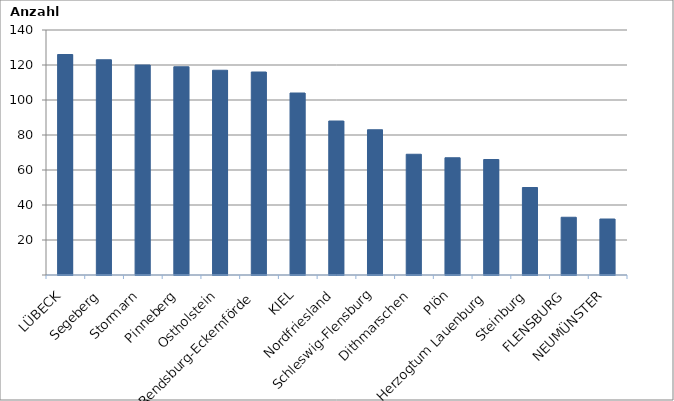
| Category | Series 0 |
|---|---|
| LÜBECK | 126 |
| Segeberg | 123 |
| Stormarn | 120 |
| Pinneberg | 119 |
| Ostholstein | 117 |
| Rendsburg-Eckernförde | 116 |
| KIEL | 104 |
| Nordfriesland | 88 |
| Schleswig-Flensburg | 83 |
| Dithmarschen | 69 |
| Plön | 67 |
| Herzogtum Lauenburg | 66 |
| Steinburg | 50 |
| FLENSBURG | 33 |
| NEUMÜNSTER | 32 |